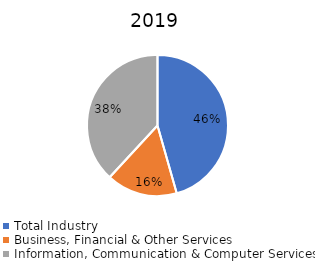
| Category | Series 0 |
|---|---|
| Total Industry | 0.456 |
| Business, Financial & Other Services | 0.163 |
| Information, Communication & Computer Services | 0.381 |